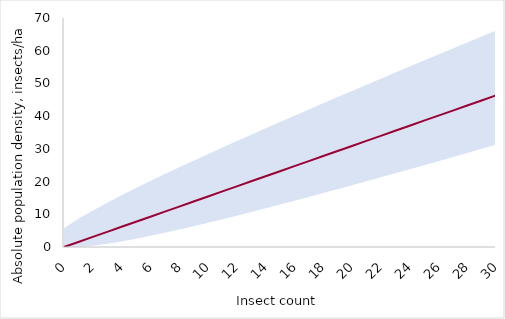
| Category | Most probable |
|---|---|
| 0.0 | 0 |
| 1.0 | 1.545 |
| 2.0 | 3.089 |
| 3.0 | 4.634 |
| 4.0 | 6.178 |
| 5.0 | 7.723 |
| 6.0 | 9.267 |
| 7.0 | 10.812 |
| 8.0 | 12.356 |
| 9.0 | 13.901 |
| 10.0 | 15.445 |
| 11.0 | 16.99 |
| 12.0 | 18.534 |
| 13.0 | 20.079 |
| 14.0 | 21.623 |
| 15.0 | 23.168 |
| 16.0 | 24.712 |
| 17.0 | 26.257 |
| 18.0 | 27.802 |
| 19.0 | 29.346 |
| 20.0 | 30.891 |
| 21.0 | 32.435 |
| 22.0 | 33.98 |
| 23.0 | 35.524 |
| 24.0 | 37.069 |
| 25.0 | 38.613 |
| 26.0 | 40.158 |
| 27.0 | 41.702 |
| 28.0 | 43.247 |
| 29.0 | 44.791 |
| 30.0 | 46.336 |